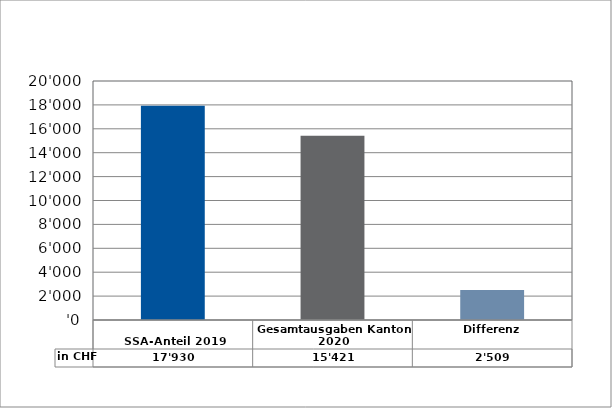
| Category | in CHF |
|---|---|
| 
SSA-Anteil 2019

 | 17930 |
| Gesamtausgaben Kanton 2020
 | 15421.05 |
| Differenz | 2508.95 |